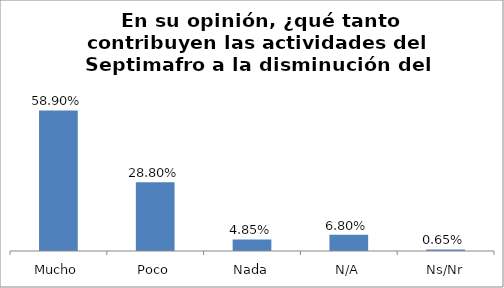
| Category | Total |
|---|---|
| Mucho | 0.589 |
| Poco | 0.288 |
| Nada | 0.049 |
| N/A | 0.068 |
| Ns/Nr | 0.006 |